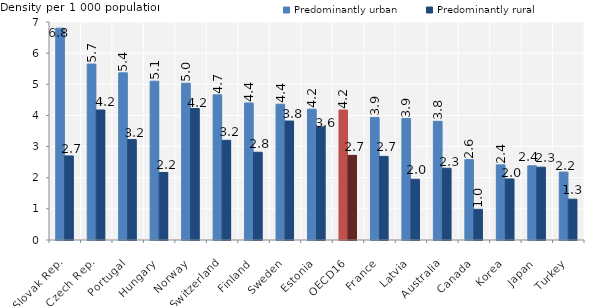
| Category | Predominantly urban | Predominantly rural |
|---|---|---|
| Slovak Rep. | 6.8 | 2.7 |
| Czech Rep. | 5.65 | 4.175 |
| Portugal | 5.367 | 3.225 |
| Hungary | 5.1 | 2.167 |
| Norway | 5.033 | 4.222 |
| Switzerland | 4.66 | 3.2 |
| Finland | 4.4 | 2.817 |
| Sweden | 4.36 | 3.82 |
| Estonia | 4.2 | 3.633 |
| OECD16 | 4.173 | 2.718 |
| France | 3.936 | 2.685 |
| Latvia | 3.9 | 1.95 |
| Australia | 3.811 | 2.303 |
| Canada | 2.579 | 0.986 |
| Korea | 2.412 | 1.96 |
| Japan | 2.383 | 2.338 |
| Turkey | 2.18 | 1.31 |